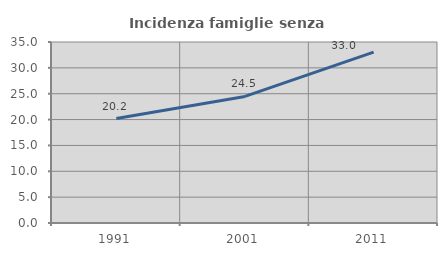
| Category | Incidenza famiglie senza nuclei |
|---|---|
| 1991.0 | 20.197 |
| 2001.0 | 24.475 |
| 2011.0 | 33.03 |